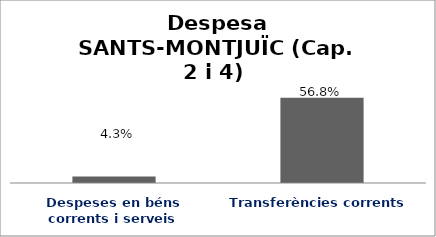
| Category | Series 0 |
|---|---|
| Despeses en béns corrents i serveis | 0.043 |
| Transferències corrents | 0.568 |